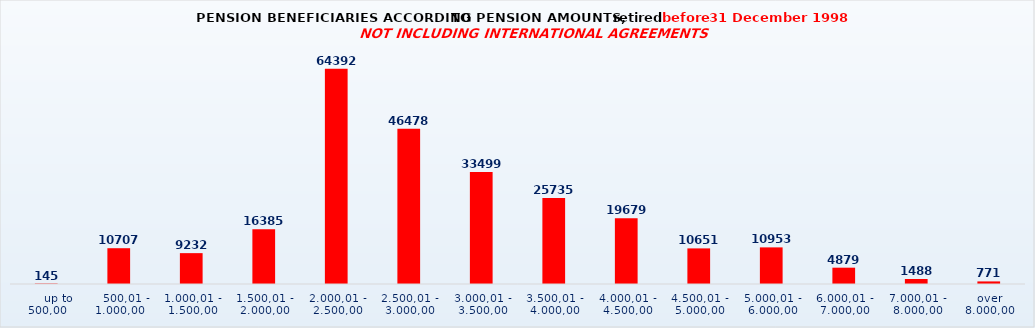
| Category | Series 0 |
|---|---|
|      up to 500,00 | 145 |
|    500,01 - 1.000,00 | 10707 |
| 1.000,01 - 1.500,00 | 9232 |
| 1.500,01 - 2.000,00 | 16385 |
| 2.000,01 - 2.500,00 | 64392 |
| 2.500,01 - 3.000,00 | 46478 |
| 3.000,01 - 3.500,00 | 33499 |
| 3.500,01 - 4.000,00 | 25735 |
| 4.000,01 - 4.500,00 | 19679 |
| 4.500,01 - 5.000,00 | 10651 |
| 5.000,01 - 6.000,00 | 10953 |
| 6.000,01 - 7.000,00 | 4879 |
| 7.000,01 - 8.000,00 | 1488 |
| over 8.000,00 | 771 |